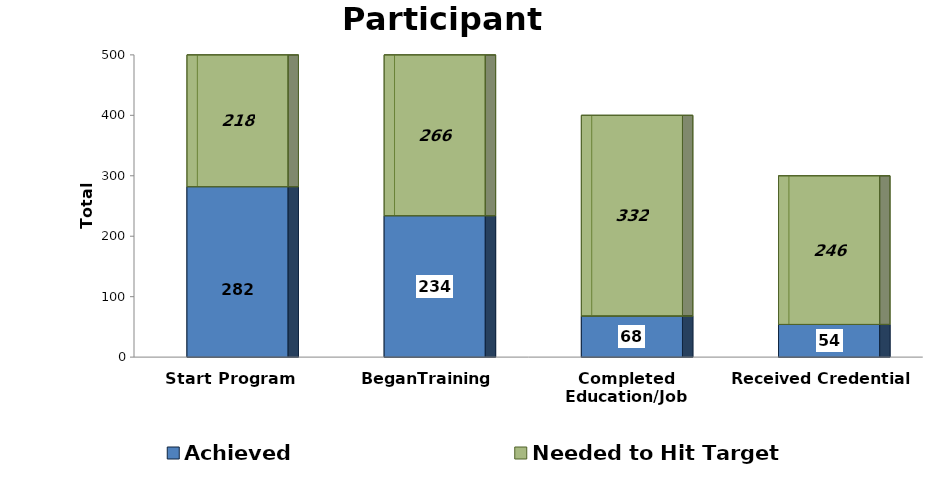
| Category | Achieved | Needed to Hit Target |
|---|---|---|
| Start Program | 282 | 218 |
| BeganTraining | 234 | 266 |
| Completed Education/Job Training | 68 | 332 |
| Received Credential | 54 | 246 |